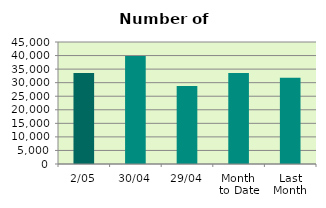
| Category | Series 0 |
|---|---|
| 2/05 | 33600 |
| 30/04 | 39828 |
| 29/04 | 28728 |
| Month 
to Date | 33600 |
| Last
Month | 31788.9 |